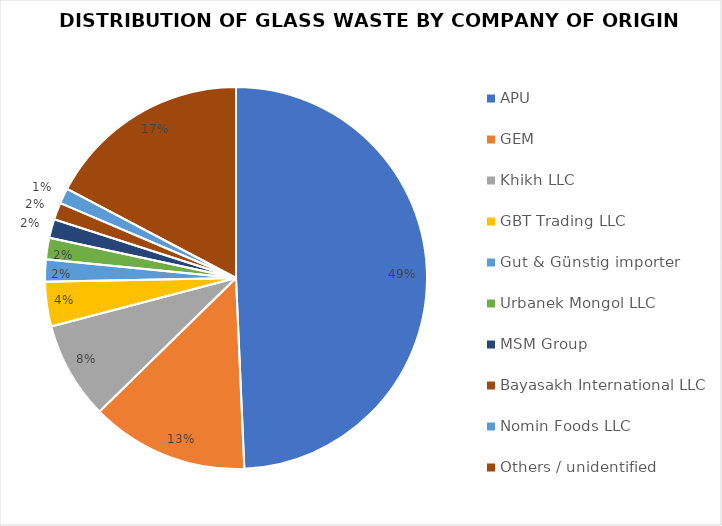
| Category | Series 0 |
|---|---|
| APU | 1841 |
| GEM | 499 |
| Khikh LLC | 308 |
| GBT Trading LLC | 141 |
| Gut & Günstig importer | 70 |
| Urbanek Mongol LLC | 68 |
| MSM Group | 59 |
| Bayasakh International LLC | 54 |
| Nomin Foods LLC | 49 |
| Others / unidentified | 645 |